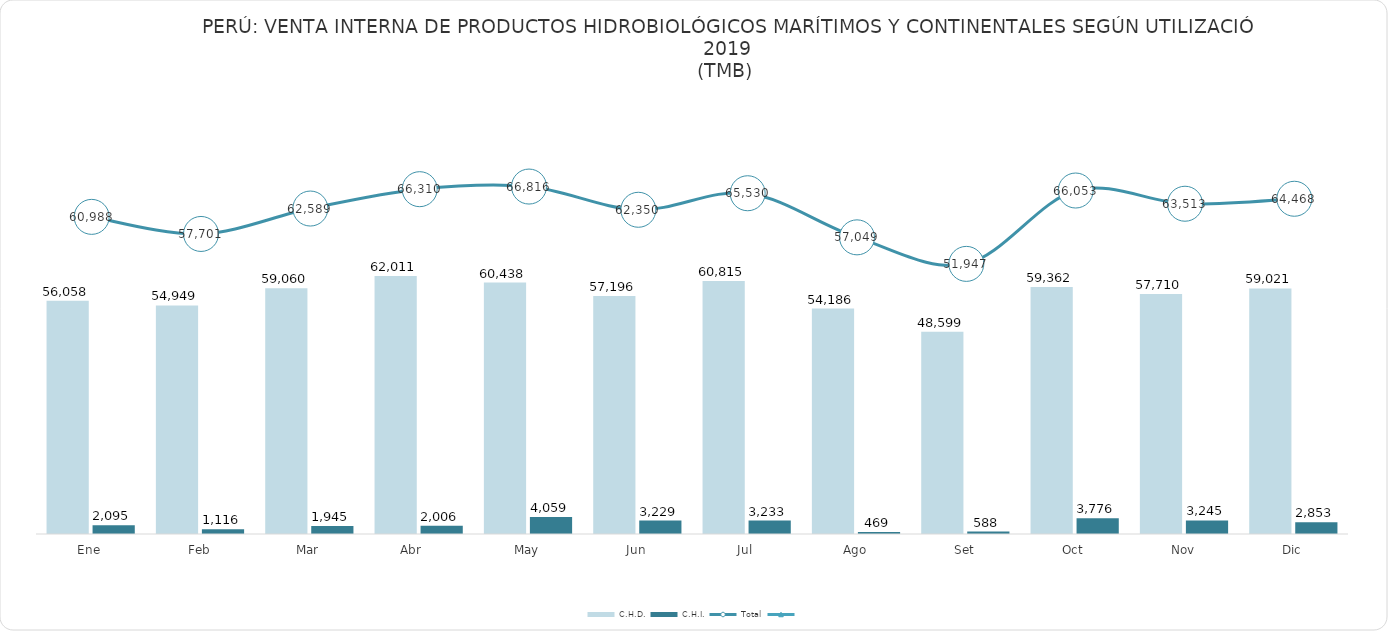
| Category | C.H.D. | C.H.I. |
|---|---|---|
| Ene | 56058.084 | 2095.16 |
| Feb | 54948.998 | 1115.985 |
| Mar | 59059.747 | 1944.66 |
| Abr    | 62010.806 | 2006.051 |
| May | 60438.096 | 4059.109 |
| Jun | 57195.807 | 3229.02 |
| Jul | 60815.251 | 3233.37 |
| Ago | 54186.496 | 468.62 |
| Set | 48598.73 | 587.517 |
| Oct | 59361.561 | 3775.79 |
| Nov | 57709.692 | 3245.359 |
| Dic | 59021.396 | 2852.678 |